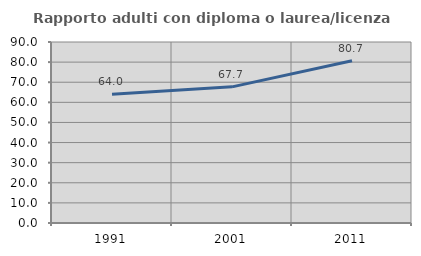
| Category | Rapporto adulti con diploma o laurea/licenza media  |
|---|---|
| 1991.0 | 63.986 |
| 2001.0 | 67.692 |
| 2011.0 | 80.672 |